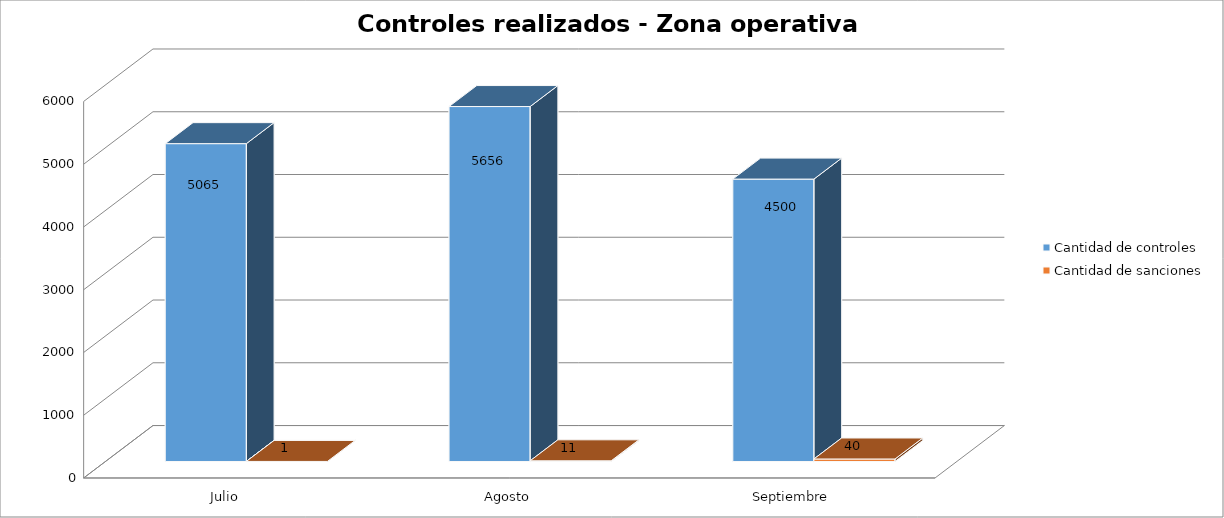
| Category | Cantidad de controles | Cantidad de sanciones |
|---|---|---|
| Julio | 5065 | 1 |
| Agosto | 5656 | 11 |
| Septiembre | 4500 | 40 |